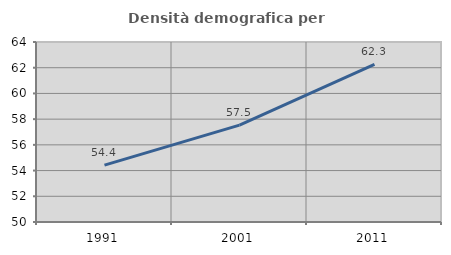
| Category | Densità demografica |
|---|---|
| 1991.0 | 54.419 |
| 2001.0 | 57.537 |
| 2011.0 | 62.261 |